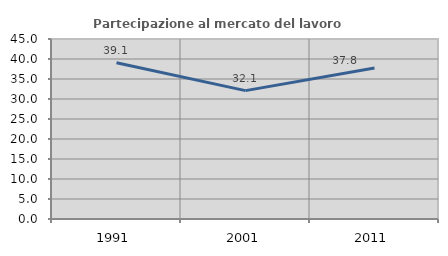
| Category | Partecipazione al mercato del lavoro  femminile |
|---|---|
| 1991.0 | 39.068 |
| 2001.0 | 32.096 |
| 2011.0 | 37.753 |